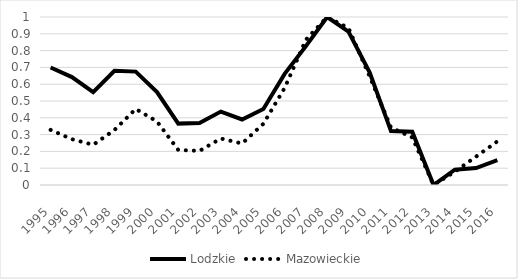
| Category | Lodzkie | Mazowieckie |
|---|---|---|
| 1995-01-01 | 0.699 | 0.328 |
| 1996-01-01 | 0.643 | 0.273 |
| 1997-01-01 | 0.552 | 0.239 |
| 1998-01-01 | 0.68 | 0.327 |
| 1999-01-01 | 0.675 | 0.453 |
| 2000-01-01 | 0.553 | 0.378 |
| 2001-01-01 | 0.365 | 0.209 |
| 2002-01-01 | 0.369 | 0.203 |
| 2003-01-01 | 0.437 | 0.277 |
| 2004-01-01 | 0.39 | 0.247 |
| 2005-01-01 | 0.452 | 0.364 |
| 2006-01-01 | 0.661 | 0.577 |
| 2007-01-01 | 0.827 | 0.865 |
| 2008-01-01 | 1 | 1 |
| 2009-01-01 | 0.913 | 0.934 |
| 2010-01-01 | 0.67 | 0.645 |
| 2011-01-01 | 0.321 | 0.342 |
| 2012-01-01 | 0.317 | 0.283 |
| 2013-01-01 | 0 | 0 |
| 2014-01-01 | 0.091 | 0.079 |
| 2015-01-01 | 0.101 | 0.169 |
| 2016-01-01 | 0.148 | 0.26 |